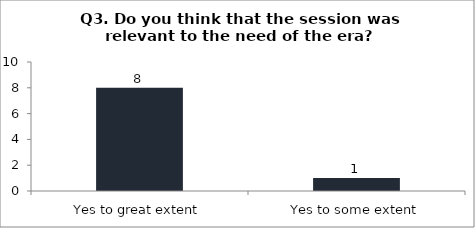
| Category | Q3. Do you think that the session was relevant to the need of the era? |
|---|---|
| Yes to great extent | 8 |
| Yes to some extent | 1 |